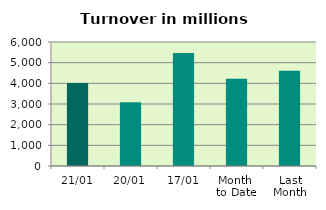
| Category | Series 0 |
|---|---|
| 21/01 | 4015.344 |
| 20/01 | 3080.428 |
| 17/01 | 5468.706 |
| Month 
to Date | 4227.691 |
| Last
Month | 4613.793 |